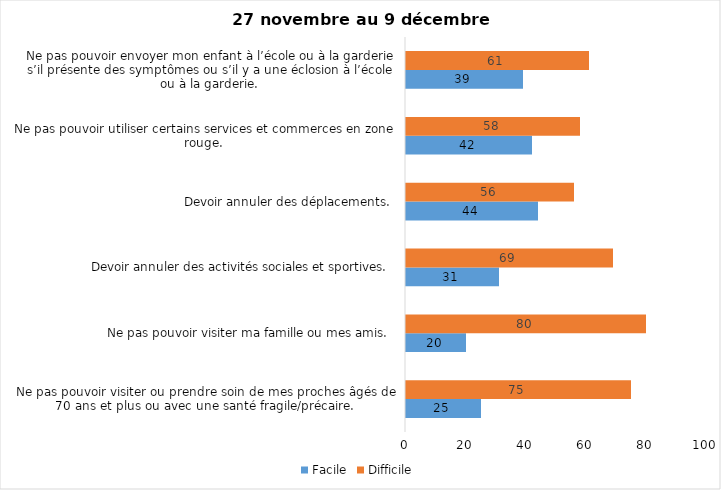
| Category | Facile | Difficile |
|---|---|---|
| Ne pas pouvoir visiter ou prendre soin de mes proches âgés de 70 ans et plus ou avec une santé fragile/précaire.  | 25 | 75 |
| Ne pas pouvoir visiter ma famille ou mes amis.  | 20 | 80 |
| Devoir annuler des activités sociales et sportives.  | 31 | 69 |
| Devoir annuler des déplacements.  | 44 | 56 |
| Ne pas pouvoir utiliser certains services et commerces en zone rouge.  | 42 | 58 |
| Ne pas pouvoir envoyer mon enfant à l’école ou à la garderie s’il présente des symptômes ou s’il y a une éclosion à l’école ou à la garderie.  | 39 | 61 |